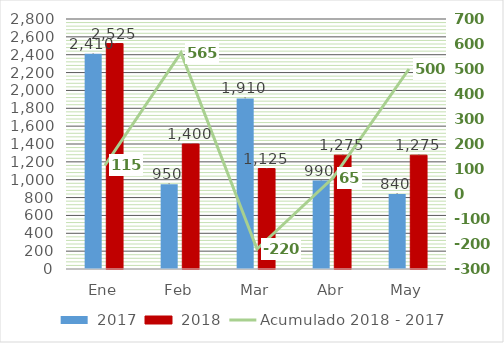
| Category |  2017 |  2018 |
|---|---|---|
| Ene | 2410 | 2525 |
| Feb | 950 | 1400 |
| Mar | 1910 | 1125 |
| Abr | 990 | 1275 |
| May | 840 | 1275 |